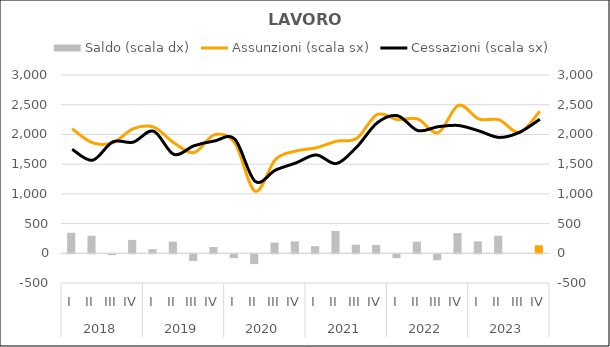
| Category | Saldo (scala dx) |
|---|---|
| 0 | 345 |
| 1 | 295 |
| 2 | -15 |
| 3 | 225 |
| 4 | 70 |
| 5 | 195 |
| 6 | -115 |
| 7 | 105 |
| 8 | -65 |
| 9 | -165 |
| 10 | 180 |
| 11 | 200 |
| 12 | 120 |
| 13 | 375 |
| 14 | 145 |
| 15 | 140 |
| 16 | -65 |
| 17 | 195 |
| 18 | -100 |
| 19 | 340 |
| 20 | 200 |
| 21 | 295 |
| 22 | 0 |
| 23 | 135 |